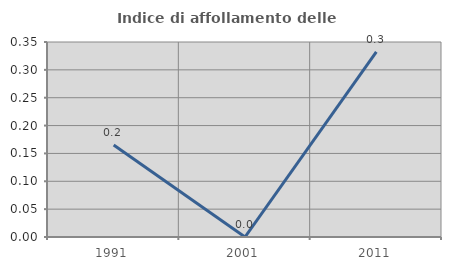
| Category | Indice di affollamento delle abitazioni  |
|---|---|
| 1991.0 | 0.165 |
| 2001.0 | 0 |
| 2011.0 | 0.332 |